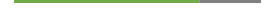
| Category | Red | Orange | Yellow | Green | None |
|---|---|---|---|---|---|
| 0 | 0 | 0 | 0 | 0.75 | 0.25 |